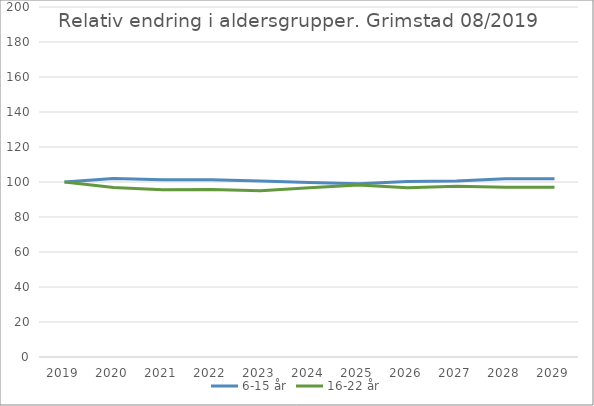
| Category | 6-15 år | 16-22 år |
|---|---|---|
| 2019 | 100 | 100 |
| 2020 | 101.991 | 96.912 |
| 2021 | 101.284 | 95.632 |
| 2022 | 101.335 | 95.76 |
| 2023 | 100.595 | 94.999 |
| 2024 | 99.667 | 96.702 |
| 2025 | 98.963 | 98.251 |
| 2026 | 100.305 | 96.736 |
| 2027 | 100.591 | 97.615 |
| 2028 | 101.9 | 96.931 |
| 2029 | 101.788 | 96.998 |